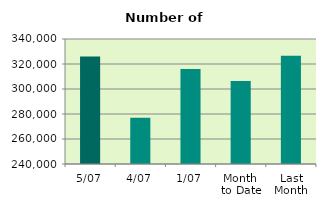
| Category | Series 0 |
|---|---|
| 5/07 | 326064 |
| 4/07 | 277062 |
| 1/07 | 316010 |
| Month 
to Date | 306378.667 |
| Last
Month | 326674.818 |